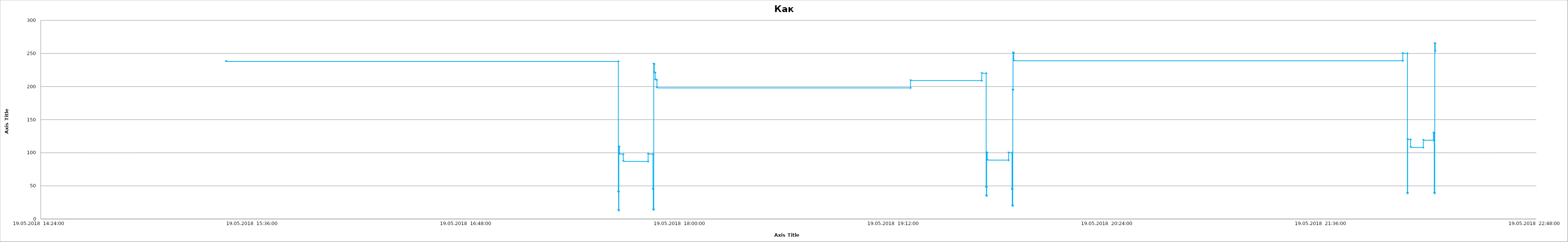
| Category | Series 0 |
|---|---|
| 43239.64341435185 | 238 |
| 43239.73517361111 | 41 |
| 43239.73523148148 | 13 |
| 43239.735289351855 | 109 |
| 43239.73540509259 | 98 |
| 43239.73631944445 | 87 |
| 43239.7421412037 | 98 |
| 43239.74328703704 | 45 |
| 43239.74334490741 | 14 |
| 43239.74346064815 | 234 |
| 43239.743576388886 | 221 |
| 43239.74380787037 | 210 |
| 43239.74420138889 | 198 |
| 43239.80355324074 | 209 |
| 43239.82021990741 | 220 |
| 43239.82125 | 48 |
| 43239.82130787037 | 35 |
| 43239.82136574074 | 100 |
| 43239.82148148148 | 89 |
| 43239.82650462963 | 100 |
| 43239.82730324074 | 45 |
| 43239.827361111114 | 20 |
| 43239.82747685185 | 195 |
| 43239.82753472222 | 251 |
| 43239.82770833333 | 239 |
| 43239.91873842593 | 250 |
| 43239.91982638889 | 39 |
| 43239.91988425926 | 120 |
| 43239.92056712963 | 108 |
| 43239.92354166666 | 119 |
| 43239.9259375 | 130 |
| 43239.92611111111 | 39 |
| 43239.92622685185 | 265 |
| 43239.92634259259 | 253 |